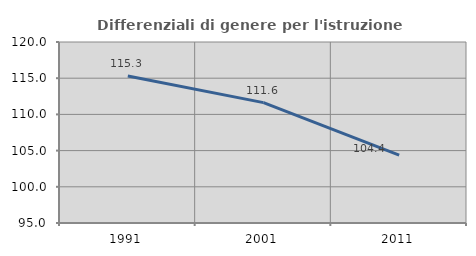
| Category | Differenziali di genere per l'istruzione superiore |
|---|---|
| 1991.0 | 115.295 |
| 2001.0 | 111.63 |
| 2011.0 | 104.378 |